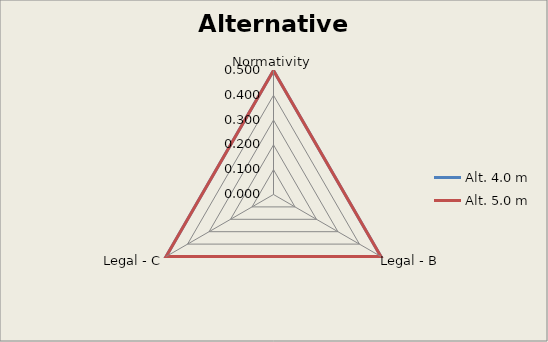
| Category | Alt. 4.0 m | Alt. 5.0 m |
|---|---|---|
| Normativity | 0.5 | 0.5 |
| Legal - B | 0.5 | 0.5 |
| Legal - C | 0.5 | 0.5 |